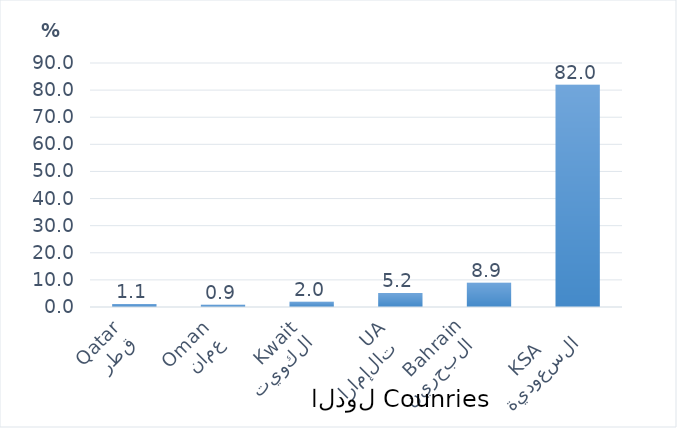
| Category | Series 0 |
|---|---|
| السعودية
  KSA      | 81.96 |
| البحرين 
 Bahrain
 | 8.918 |
| الإمارات 
UAE | 5.198 |
| الكويت
 Kwait | 1.974 |
| عمان
 Oman | 0.858 |
| قطر
  Qatar | 1.092 |